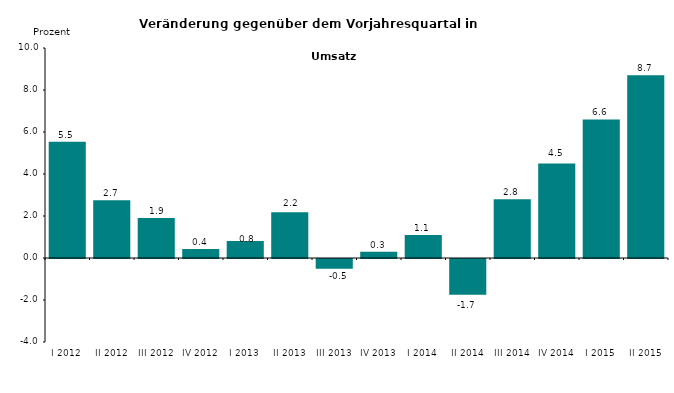
| Category | Series 0 |
|---|---|
| I 2012 | 5.54 |
| II 2012 | 2.745 |
| III 2012 | 1.908 |
| IV 2012 | 0.427 |
| I 2013 | 0.81 |
| II 2013 | 2.181 |
| III 2013 | -0.465 |
| IV 2013 | 0.3 |
| I 2014 | 1.1 |
| II 2014 | -1.7 |
| III 2014 | 2.8 |
| IV 2014 | 4.5 |
| I 2015 | 6.6 |
| II 2015 | 8.7 |